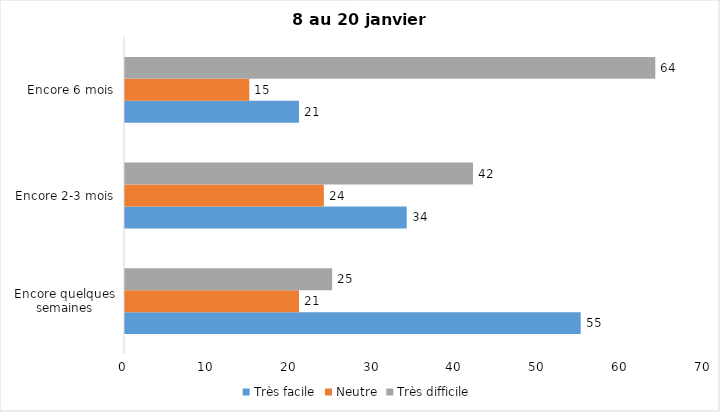
| Category | Très facile | Neutre | Très difficile |
|---|---|---|---|
| Encore quelques semaines | 55 | 21 | 25 |
| Encore 2-3 mois | 34 | 24 | 42 |
| Encore 6 mois | 21 | 15 | 64 |